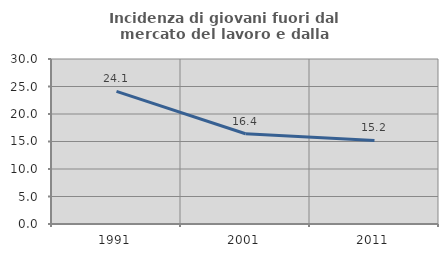
| Category | Incidenza di giovani fuori dal mercato del lavoro e dalla formazione  |
|---|---|
| 1991.0 | 24.101 |
| 2001.0 | 16.418 |
| 2011.0 | 15.184 |